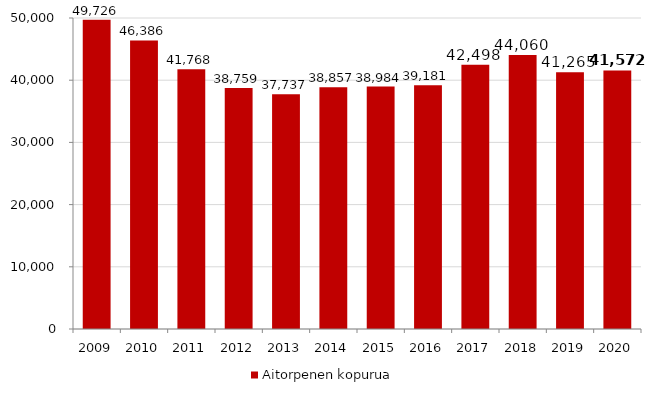
| Category | Aitorpenen kopurua |
|---|---|
| 2009.0 | 49726 |
| 2010.0 | 46386 |
| 2011.0 | 41768 |
| 2012.0 | 38759 |
| 2013.0 | 37737 |
| 2014.0 | 38857 |
| 2015.0 | 38984 |
| 2016.0 | 39181 |
| 2017.0 | 42498 |
| 2018.0 | 44060 |
| 2019.0 | 41265 |
| 2020.0 | 41572 |